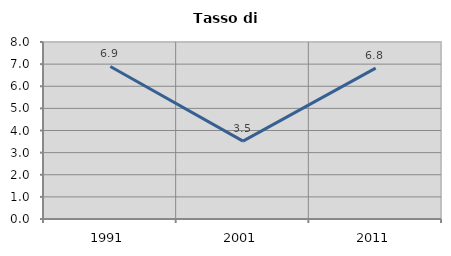
| Category | Tasso di disoccupazione   |
|---|---|
| 1991.0 | 6.894 |
| 2001.0 | 3.52 |
| 2011.0 | 6.818 |